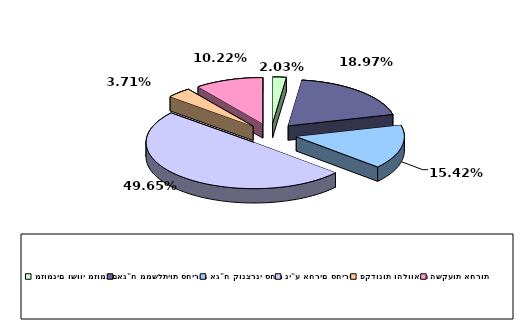
| Category | Series 0 |
|---|---|
| מזומנים ושווי מזומנים | 0.02 |
| אג"ח ממשלתיות סחירות | 0.19 |
| אג"ח קונצרני סחיר | 0.154 |
| ני"ע אחרים סחירים | 0.497 |
| פקדונות והלוואות | 0.037 |
| השקעות אחרות | 0.102 |